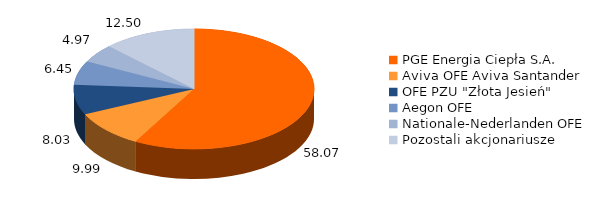
| Category | Series 2 | Series 3 | Series 1 | Series 0 |
|---|---|---|---|---|
| PGE Energia Ciepła S.A. | 58.068 | 0 | 8652173 | 8652173 |
| Aviva OFE Aviva Santander | 9.993 | 58.068 | 1489000 | 1489000 |
| OFE PZU "Złota Jesień" | 8.025 | 9.993 | 1195792 | 1195792 |
| Aegon OFE | 6.448 | 8.025 | 960690 | 960690 |
| Nationale-Nederlanden OFE  | 4.966 | 6.448 | 740000 | 740000 |
| Pozostali akcjonariusze | 12.499 | 4.966 | 1862345 | 1862345 |